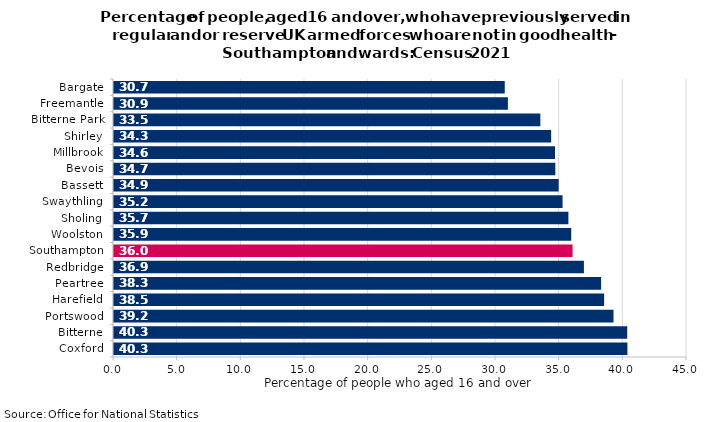
| Category | Previously served in regular and or reserve UK armed forces |
|---|---|
| Coxford | 40.319 |
| Bitterne | 40.305 |
| Portswood | 39.228 |
| Harefield | 38.491 |
| Peartree | 38.257 |
| Redbridge | 36.905 |
| Southampton | 36.014 |
| Woolston | 35.908 |
| Sholing | 35.685 |
| Swaythling | 35.227 |
| Bassett | 34.921 |
| Bevois | 34.659 |
| Millbrook | 34.633 |
| Shirley | 34.332 |
| Bitterne Park | 33.482 |
| Freemantle | 30.933 |
| Bargate | 30.688 |